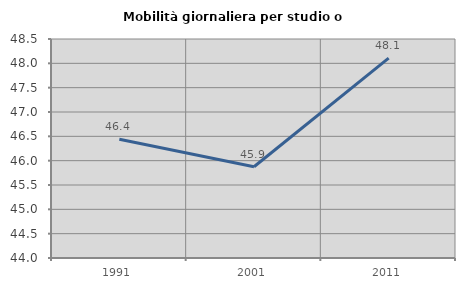
| Category | Mobilità giornaliera per studio o lavoro |
|---|---|
| 1991.0 | 46.441 |
| 2001.0 | 45.874 |
| 2011.0 | 48.106 |